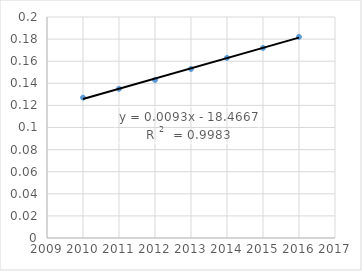
| Category | Series 0 |
|---|---|
| 2010.0 | 0.127 |
| 2011.0 | 0.135 |
| 2012.0 | 0.143 |
| 2013.0 | 0.153 |
| 2014.0 | 0.163 |
| 2015.0 | 0.172 |
| 2016.0 | 0.182 |